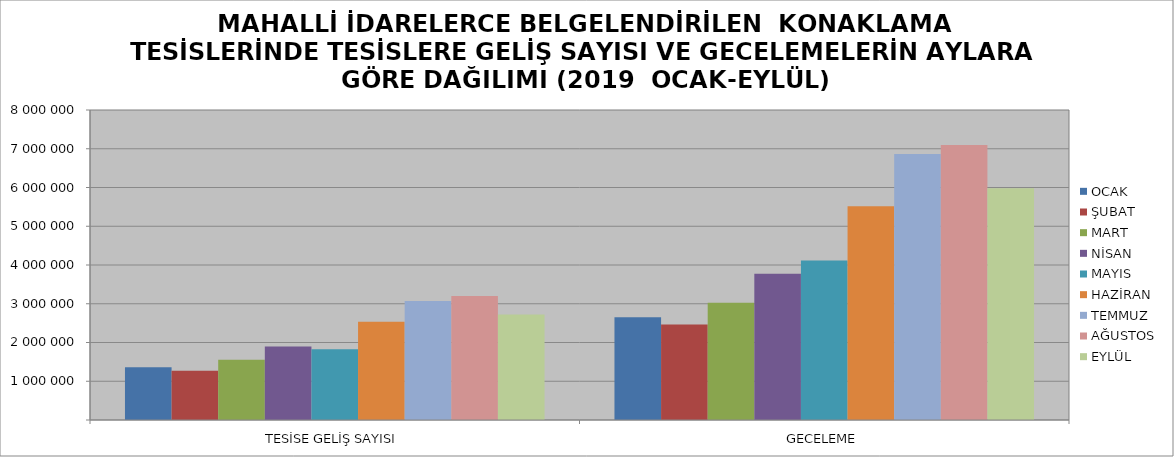
| Category | OCAK | ŞUBAT | MART | NİSAN | MAYIS | HAZİRAN | TEMMUZ | AĞUSTOS | EYLÜL |
|---|---|---|---|---|---|---|---|---|---|
| TESİSE GELİŞ SAYISI | 1363187 | 1273727 | 1552518 | 1898202 | 1826154 | 2537491 | 3073499 | 3201724 | 2721047 |
| GECELEME | 2649437 | 2462023 | 3024704 | 3772615 | 4117532 | 5513568 | 6866550 | 7097153 | 5980815 |